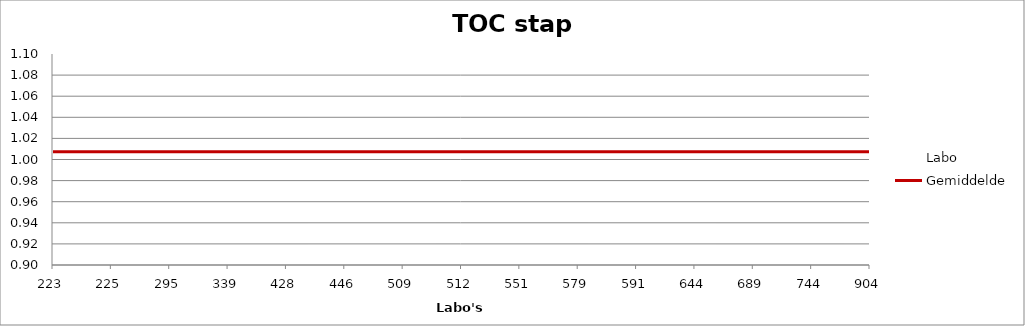
| Category | Labo | Gemiddelde |
|---|---|---|
| 223.0 | 0.98 | 1.007 |
| 225.0 | 1.033 | 1.007 |
| 295.0 | 0.993 | 1.007 |
| 339.0 | 1.005 | 1.007 |
| 428.0 | 1.001 | 1.007 |
| 446.0 | 1.014 | 1.007 |
| 509.0 | 0.98 | 1.007 |
| 512.0 | 1.033 | 1.007 |
| 551.0 | 1.033 | 1.007 |
| 579.0 | 0.999 | 1.007 |
| 591.0 | 0.993 | 1.007 |
| 644.0 | 1.02 | 1.007 |
| 689.0 | 0.98 | 1.007 |
| 744.0 | 1.073 | 1.007 |
| 904.0 | 1.001 | 1.007 |